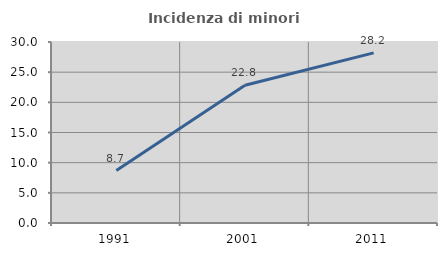
| Category | Incidenza di minori stranieri |
|---|---|
| 1991.0 | 8.696 |
| 2001.0 | 22.821 |
| 2011.0 | 28.191 |